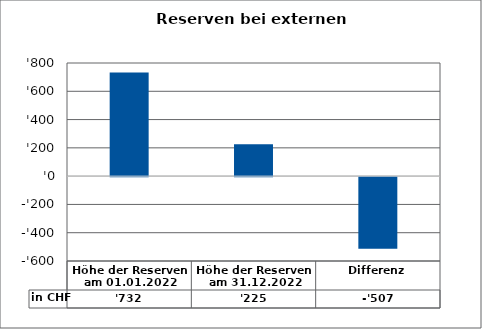
| Category | in CHF |
|---|---|
| Höhe der Reserven am 01.01.2022 | 732 |
| Höhe der Reserven am 31.12.2022 | 225 |
| Differenz | -507 |